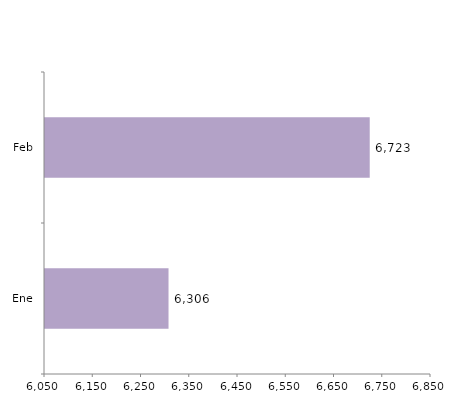
| Category | Series 0 |
|---|---|
| Ene | 6306 |
| Feb | 6723 |